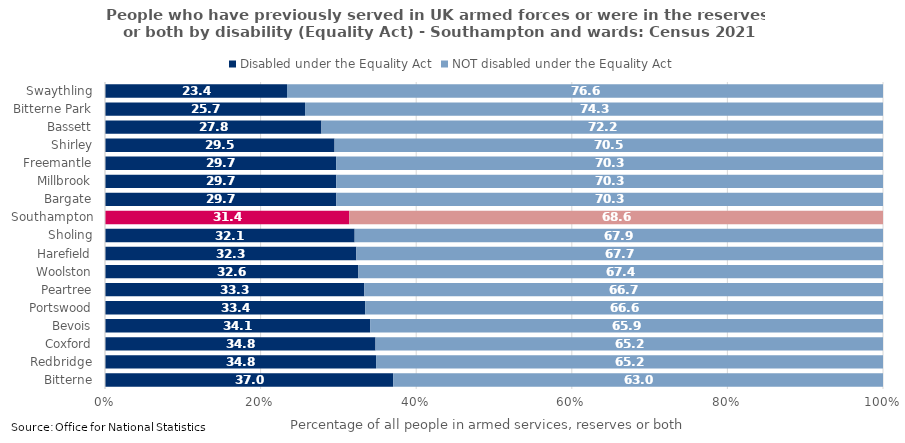
| Category | Disabled under the Equality Act | NOT disabled under the Equality Act |
|---|---|---|
| Bitterne | 37.037 | 62.963 |
| Redbridge | 34.845 | 65.155 |
| Coxford | 34.773 | 65.227 |
| Bevois | 34.078 | 65.922 |
| Portswood | 33.439 | 66.561 |
| Peartree | 33.333 | 66.667 |
| Woolston | 32.568 | 67.432 |
| Harefield | 32.308 | 67.692 |
| Sholing | 32.091 | 67.909 |
| Southampton | 31.405 | 68.595 |
| Bargate | 29.737 | 70.263 |
| Millbrook | 29.724 | 70.276 |
| Freemantle | 29.708 | 70.292 |
| Shirley | 29.508 | 70.492 |
| Bassett | 27.822 | 72.178 |
| Bitterne Park | 25.714 | 74.286 |
| Swaythling | 23.396 | 76.604 |